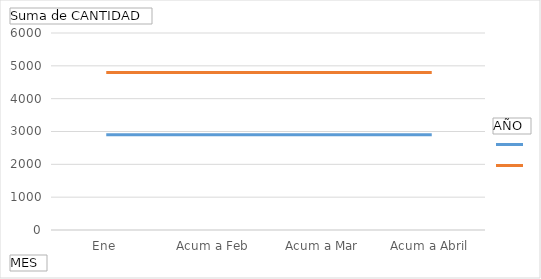
| Category | 2017 | 2018 |
|---|---|---|
| Ene |  | 1900 |
| Acum a Feb |  | 2145 |
| Acum a Mar |  | 2140 |
| Acum a Abril |  | 1175 |